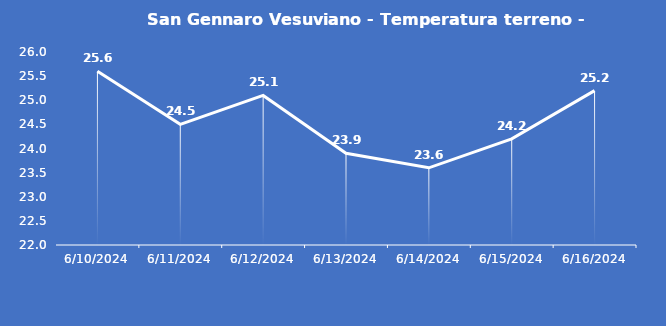
| Category | San Gennaro Vesuviano - Temperatura terreno - Grezzo (°C) |
|---|---|
| 6/10/24 | 25.6 |
| 6/11/24 | 24.5 |
| 6/12/24 | 25.1 |
| 6/13/24 | 23.9 |
| 6/14/24 | 23.6 |
| 6/15/24 | 24.2 |
| 6/16/24 | 25.2 |